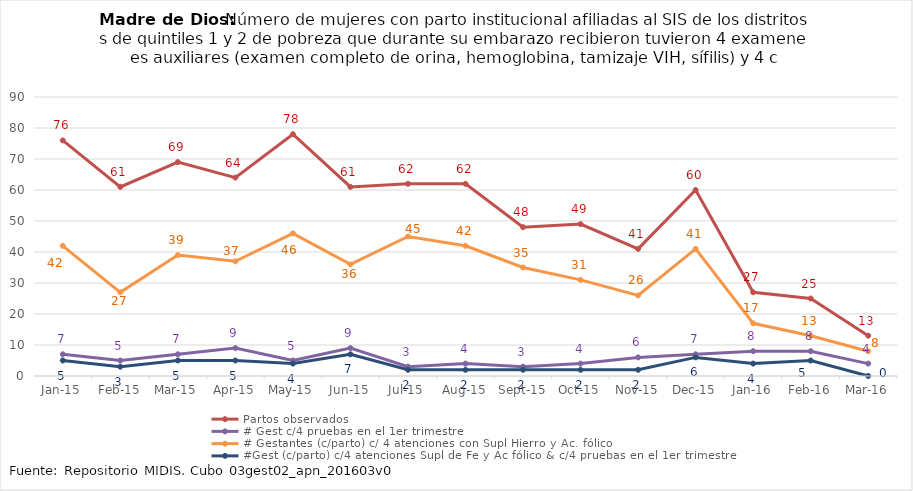
| Category | Partos observados | # Gest c/4 pruebas en el 1er trimestre | # Gestantes (c/parto) c/ 4 atenciones con Supl Hierro y Ac. fólico | #Gest (c/parto) c/4 atenciones Supl de Fe y Ac fólico & c/4 pruebas en el 1er trimestre |
|---|---|---|---|---|
| 2015-01-01 | 76 | 7 | 42 | 5 |
| 2015-02-01 | 61 | 5 | 27 | 3 |
| 2015-03-01 | 69 | 7 | 39 | 5 |
| 2015-04-01 | 64 | 9 | 37 | 5 |
| 2015-05-01 | 78 | 5 | 46 | 4 |
| 2015-06-01 | 61 | 9 | 36 | 7 |
| 2015-07-01 | 62 | 3 | 45 | 2 |
| 2015-08-01 | 62 | 4 | 42 | 2 |
| 2015-09-01 | 48 | 3 | 35 | 2 |
| 2015-10-01 | 49 | 4 | 31 | 2 |
| 2015-11-01 | 41 | 6 | 26 | 2 |
| 2015-12-01 | 60 | 7 | 41 | 6 |
| 2016-01-01 | 27 | 8 | 17 | 4 |
| 2016-02-01 | 25 | 8 | 13 | 5 |
| 2016-03-01 | 13 | 4 | 8 | 0 |